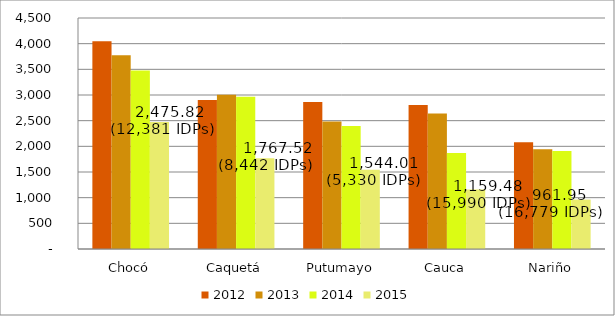
| Category | 2012 | 2013 | 2014 | 2015 |
|---|---|---|---|---|
| Chocó | 4044.733 | 3771.973 | 3479 | 2475.824 |
| Caquetá | 2903.91 | 3007.023 | 2966.108 | 1767.518 |
| Putumayo | 2862.441 | 2481.501 | 2394.776 | 1544.015 |
| Cauca | 2805.268 | 2637.694 | 1871.483 | 1159.477 |
| Nariño | 2080.251 | 1943.778 | 1907.894 | 961.947 |